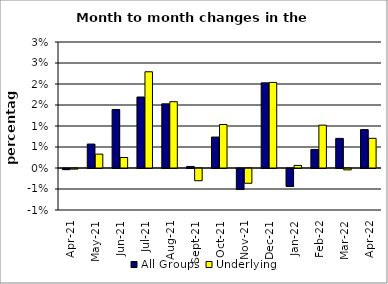
| Category | All Groups | Underlying |
|---|---|---|
| 2021-04-01 | 0 | 0 |
| 2021-05-01 | 0.006 | 0.003 |
| 2021-06-01 | 0.014 | 0.003 |
| 2021-07-01 | 0.017 | 0.023 |
| 2021-08-01 | 0.015 | 0.016 |
| 2021-09-01 | 0 | -0.003 |
| 2021-10-01 | 0.007 | 0.01 |
| 2021-11-01 | -0.005 | -0.004 |
| 2021-12-01 | 0.02 | 0.02 |
| 2022-01-01 | -0.004 | 0.001 |
| 2022-02-01 | 0.004 | 0.01 |
| 2022-03-01 | 0.007 | 0 |
| 2022-04-01 | 0.009 | 0.007 |